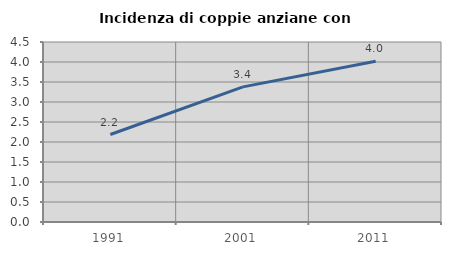
| Category | Incidenza di coppie anziane con figli |
|---|---|
| 1991.0 | 2.187 |
| 2001.0 | 3.378 |
| 2011.0 | 4.019 |